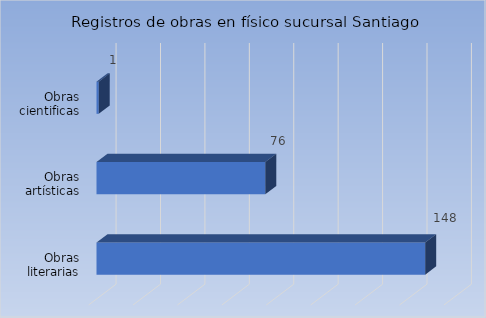
| Category | Cantidad |
|---|---|
| Obras literarias | 148 |
| Obras artísticas | 76 |
| Obras cientificas | 1 |